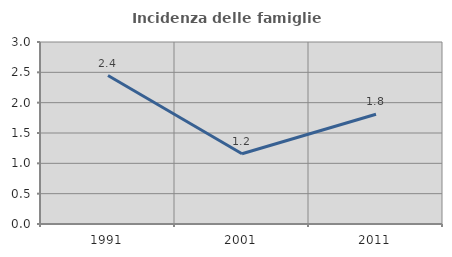
| Category | Incidenza delle famiglie numerose |
|---|---|
| 1991.0 | 2.447 |
| 2001.0 | 1.157 |
| 2011.0 | 1.809 |